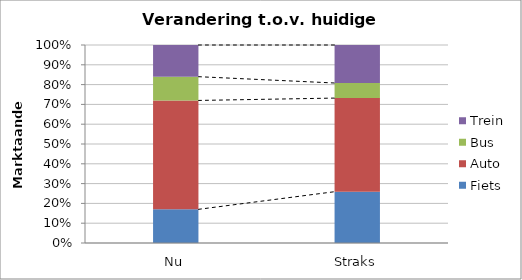
| Category | Fiets | Auto | Bus | Trein |
|---|---|---|---|---|
| Nu | 0.17 | 0.55 | 0.12 | 0.16 |
| Straks | 0.259 | 0.473 | 0.076 | 0.192 |